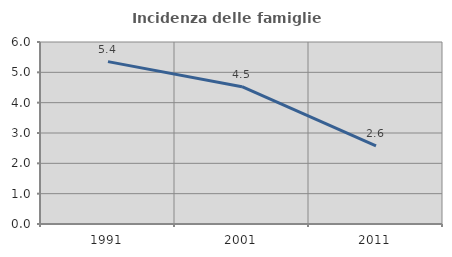
| Category | Incidenza delle famiglie numerose |
|---|---|
| 1991.0 | 5.353 |
| 2001.0 | 4.527 |
| 2011.0 | 2.574 |